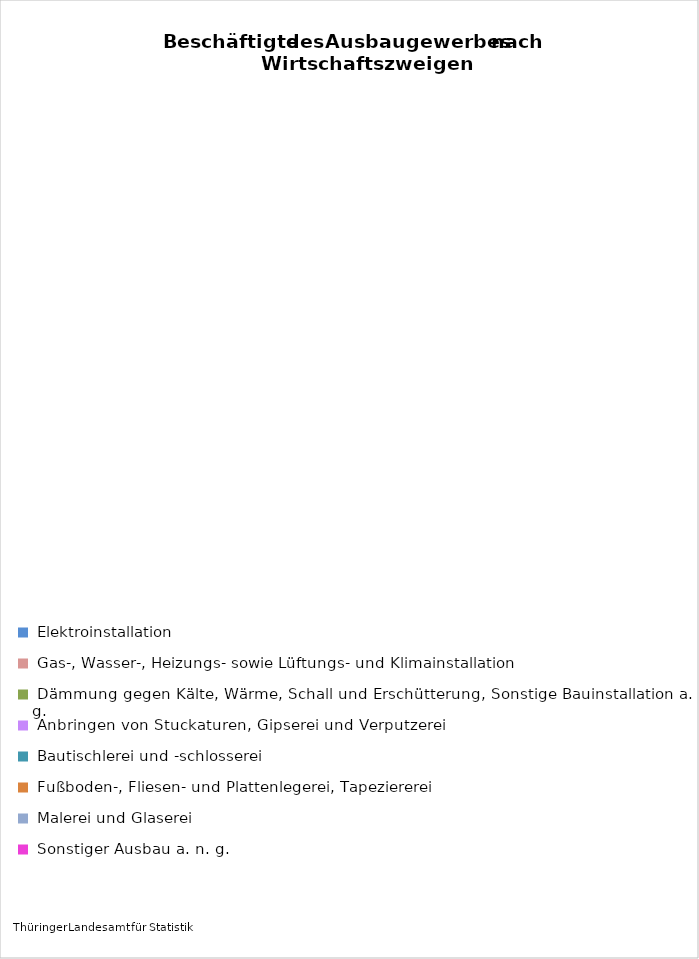
| Category | Anzahl Beschäftigte 2016 |
|---|---|
| Elektroinstallation | 5220 |
| Gas-, Wasser-, Heizungs- sowie Lüftungs- und Klimainstallation | 3940 |
| Dämmung gegen Kälte, Wärme, Schall und Erschütterung, Sonstige Bauinstallation a. n. g. | 829 |
| Anbringen von Stuckaturen, Gipserei und Verputzerei | 211 |
| Bautischlerei und -schlosserei | 1031 |
| Fußboden-, Fliesen- und Plattenlegerei, Tapeziererei | 869 |
| Malerei und Glaserei | 1734 |
| Sonstiger Ausbau a. n. g. | 181 |